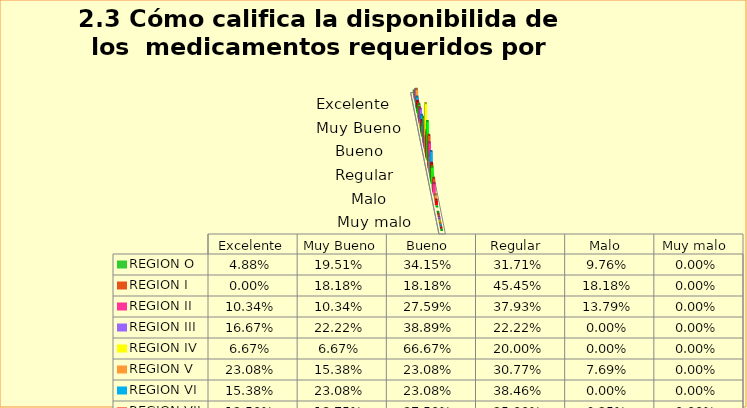
| Category | REGION O | REGION I  | REGION II | REGION III | REGION IV | REGION V  | REGION VI  | REGION VII  | REGION VIII |
|---|---|---|---|---|---|---|---|---|---|
| Excelente | 0.049 | 0 | 0.103 | 0.167 | 0.067 | 0.231 | 0.154 | 0.125 | 0.077 |
| Muy Bueno | 0.195 | 0.182 | 0.103 | 0.222 | 0.067 | 0.154 | 0.231 | 0.188 | 0.154 |
| Bueno  | 0.341 | 0.182 | 0.276 | 0.389 | 0.667 | 0.231 | 0.231 | 0.375 | 0.538 |
| Regular  | 0.317 | 0.455 | 0.379 | 0.222 | 0.2 | 0.308 | 0.385 | 0.25 | 0.231 |
| Malo  | 0.098 | 0.182 | 0.138 | 0 | 0 | 0.077 | 0 | 0.062 | 0 |
| Muy malo  | 0 | 0 | 0 | 0 | 0 | 0 | 0 | 0 | 0 |